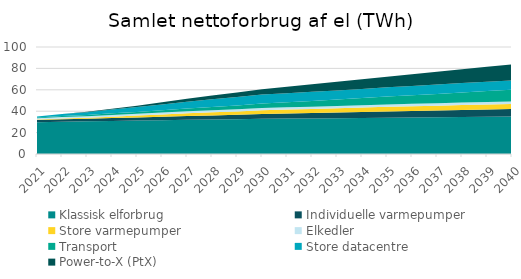
| Category | Klassisk elforbrug | Individuelle varmepumper | Store varmepumper | Elkedler | Transport | Store datacentre | Power-to-X (PtX) |
|---|---|---|---|---|---|---|---|
| 2021.0 | 29.751 | 2.009 | 0.521 | 1.148 | 0.798 | 0.901 | 0.025 |
| 2022.0 | 30.135 | 2.242 | 0.808 | 1.391 | 0.96 | 1.742 | 0.16 |
| 2023.0 | 30.519 | 2.475 | 0.952 | 1.403 | 1.15 | 2.498 | 0.495 |
| 2024.0 | 30.903 | 2.708 | 1.275 | 1.637 | 1.474 | 3.511 | 0.87 |
| 2025.0 | 31.287 | 2.94 | 1.682 | 1.718 | 1.739 | 4.527 | 1.25 |
| 2026.0 | 31.604 | 3.24 | 2.118 | 1.793 | 2.045 | 5.526 | 2 |
| 2027.0 | 31.92 | 3.539 | 2.642 | 1.898 | 2.547 | 6.394 | 2.75 |
| 2028.0 | 32.236 | 3.839 | 2.905 | 1.959 | 3.098 | 7.118 | 3.5 |
| 2029.0 | 32.553 | 4.138 | 3.111 | 2.048 | 3.576 | 7.855 | 4.25 |
| 2030.0 | 32.869 | 4.438 | 3.557 | 2.102 | 4.121 | 8.454 | 5 |
| 2031.0 | 33.069 | 4.737 | 3.703 | 2.111 | 4.693 | 8.485 | 6 |
| 2032.0 | 33.268 | 5.037 | 3.819 | 2.147 | 5.306 | 8.515 | 7 |
| 2033.0 | 33.468 | 5.336 | 3.946 | 2.183 | 5.957 | 8.546 | 8 |
| 2034.0 | 33.668 | 5.636 | 4.076 | 2.237 | 6.64 | 8.576 | 9 |
| 2035.0 | 33.894 | 5.935 | 4.229 | 2.255 | 7.359 | 8.607 | 10 |
| 2036.0 | 34.134 | 6.145 | 4.3 | 2.273 | 8.083 | 8.638 | 11 |
| 2037.0 | 34.375 | 6.356 | 4.38 | 2.279 | 8.782 | 8.668 | 12 |
| 2038.0 | 34.616 | 6.566 | 4.559 | 2.339 | 9.466 | 8.699 | 13 |
| 2039.0 | 34.856 | 6.777 | 4.655 | 2.357 | 10.141 | 8.729 | 14 |
| 2040.0 | 35.097 | 6.987 | 4.732 | 2.357 | 10.822 | 8.76 | 15 |